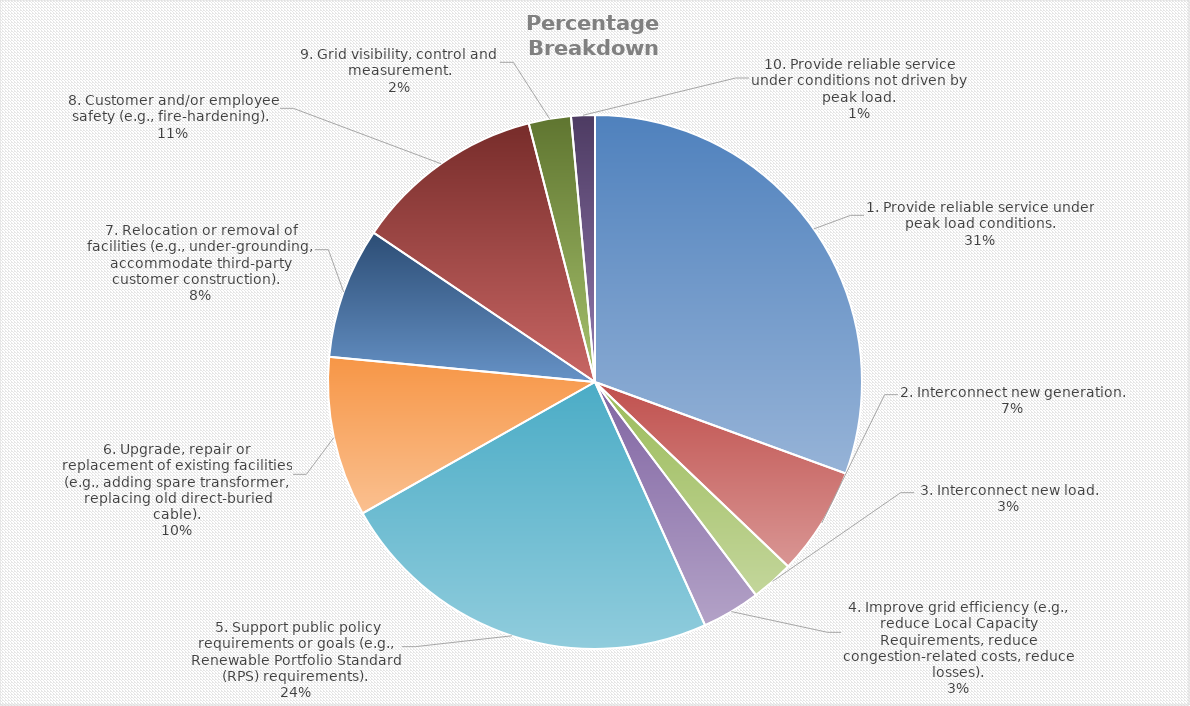
| Category | Percentage |
|---|---|
| 1. Provide reliable service under peak load conditions. | 0.306 |
| 2. Interconnect new generation. | 0.066 |
|  3. Interconnect new load. | 0.026 |
| 4. Improve grid efficiency (e.g., reduce Local Capacity Requirements, reduce congestion-related costs, reduce losses). | 0.035 |
|  5. Support public policy requirements or goals (e.g., Renewable Portfolio Standard (RPS) requirements). | 0.236 |
| 6. Upgrade, repair or replacement of existing facilities (e.g., adding spare transformer, replacing old direct-buried cable). | 0.097 |
| 7. Relocation or removal of facilities (e.g., under-grounding, accommodate third-party customer construction).   | 0.079 |
| 8. Customer and/or employee safety (e.g., fire-hardening).  | 0.116 |
| 9. Grid visibility, control and measurement. | 0.026 |
| 10. Provide reliable service under conditions not driven by peak load. | 0.014 |